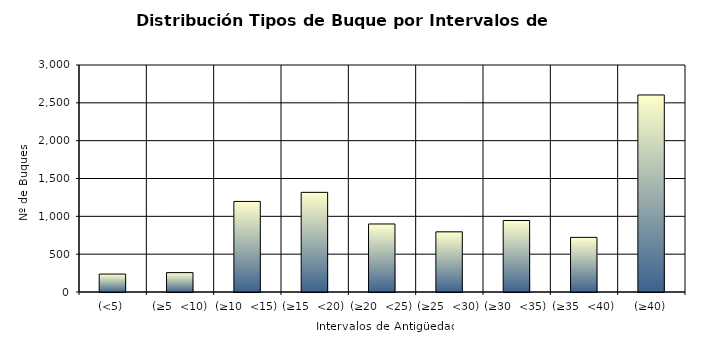
| Category | Series 0 |
|---|---|
| (<5) | 237 |
| (≥5  <10) | 256 |
| (≥10  <15) | 1197 |
| (≥15  <20) | 1317 |
| (≥20  <25) | 899 |
| (≥25  <30) | 795 |
| (≥30  <35) | 945 |
| (≥35  <40) | 722 |
| (≥40) | 2604 |